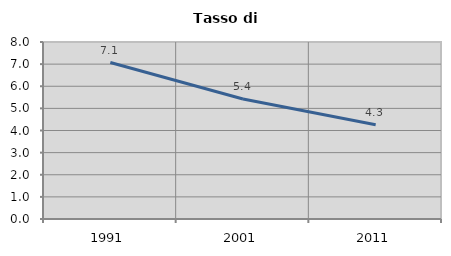
| Category | Tasso di disoccupazione   |
|---|---|
| 1991.0 | 7.071 |
| 2001.0 | 5.426 |
| 2011.0 | 4.257 |